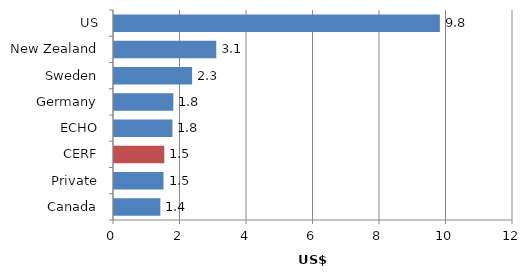
| Category | Committed (US$ million) |
|---|---|
| Canada | 1.394 |
| Private | 1.489 |
| CERF | 1.512 |
| ECHO | 1.757 |
| Germany | 1.785 |
| Sweden | 2.349 |
| New Zealand | 3.076 |
| US | 9.8 |